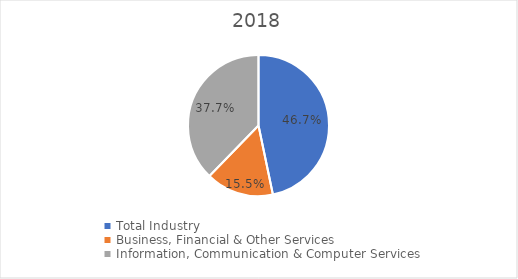
| Category | Series 0 |
|---|---|
| Total Industry | 0.467 |
| Business, Financial & Other Services | 0.155 |
| Information, Communication & Computer Services | 0.377 |